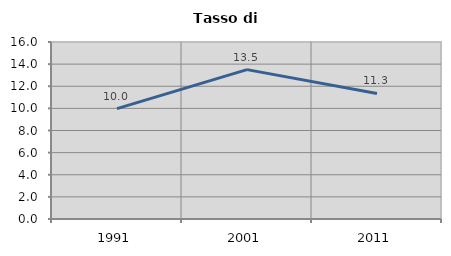
| Category | Tasso di disoccupazione   |
|---|---|
| 1991.0 | 9.977 |
| 2001.0 | 13.504 |
| 2011.0 | 11.346 |